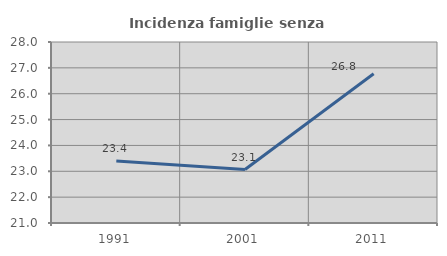
| Category | Incidenza famiglie senza nuclei |
|---|---|
| 1991.0 | 23.398 |
| 2001.0 | 23.066 |
| 2011.0 | 26.775 |